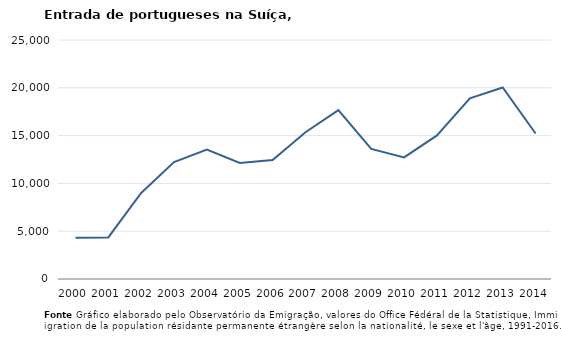
| Category | Entradas |
|---|---|
| 2000.0 | 4311 |
| 2001.0 | 4347 |
| 2002.0 | 9005 |
| 2003.0 | 12228 |
| 2004.0 | 13539 |
| 2005.0 | 12138 |
| 2006.0 | 12441 |
| 2007.0 | 15351 |
| 2008.0 | 17657 |
| 2009.0 | 13601 |
| 2010.0 | 12720 |
| 2011.0 | 15020 |
| 2012.0 | 18892 |
| 2013.0 | 20039 |
| 2014.0 | 15221 |